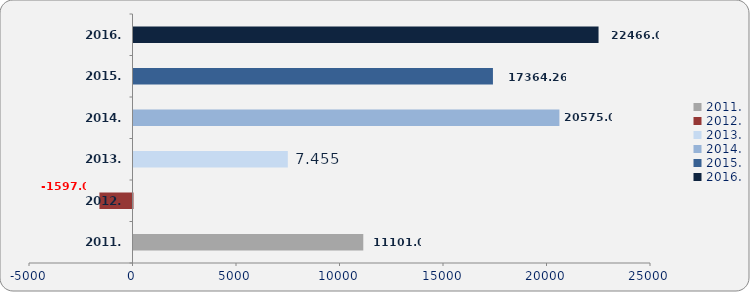
| Category | Neto dobit/gubitak |
|---|---|
| 2011. | 11101 |
| 2012. | -1597 |
| 2013. | 7455 |
| 2014. | 20575 |
| 2015. | 17364.269 |
| 2016. | 22466 |